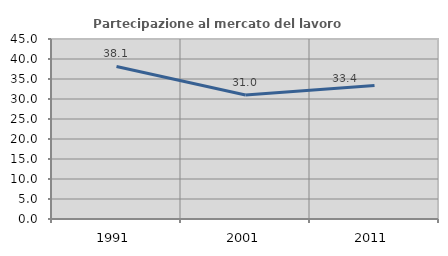
| Category | Partecipazione al mercato del lavoro  femminile |
|---|---|
| 1991.0 | 38.128 |
| 2001.0 | 30.991 |
| 2011.0 | 33.374 |